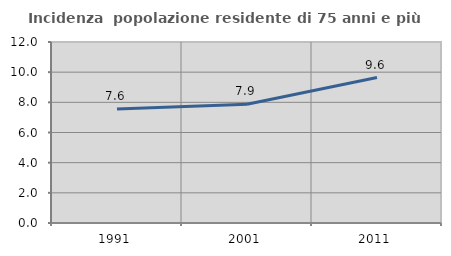
| Category | Incidenza  popolazione residente di 75 anni e più |
|---|---|
| 1991.0 | 7.553 |
| 2001.0 | 7.873 |
| 2011.0 | 9.64 |